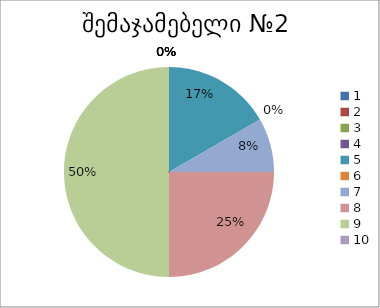
| Category | რაოდენობა | ქულა |
|---|---|---|
| 0 | 0 | 1 |
| 1 | 0 | 2 |
| 2 | 0 | 3 |
| 3 | 0 | 4 |
| 4 | 2 | 5 |
| 5 | 0 | 6 |
| 6 | 1 | 7 |
| 7 | 3 | 8 |
| 8 | 6 | 9 |
| 9 | 0 | 10 |